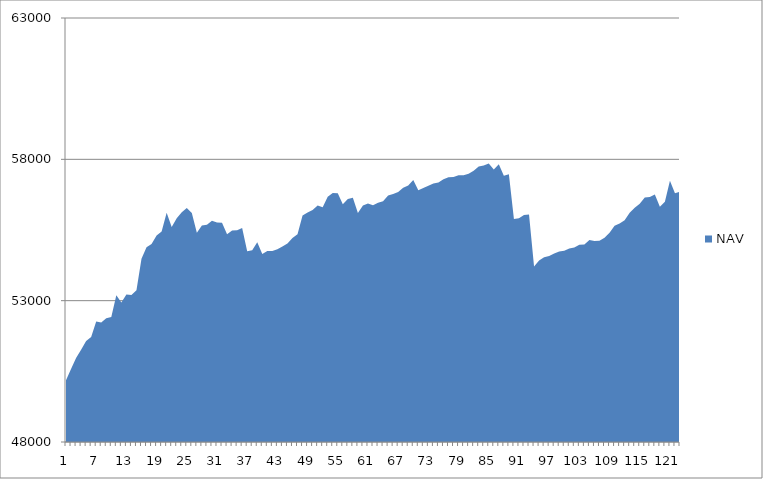
| Category | NAV |
|---|---|
| 0 | 50185.185 |
| 1 | 50585.185 |
| 2 | 50973.977 |
| 3 | 51265.977 |
| 4 | 51576.741 |
| 5 | 51711.523 |
| 6 | 52262.893 |
| 7 | 52230.24 |
| 8 | 52381.556 |
| 9 | 52425.915 |
| 10 | 53192.581 |
| 11 | 52939.146 |
| 12 | 53220.069 |
| 13 | 53197.341 |
| 14 | 53369.61 |
| 15 | 54480.721 |
| 16 | 54888.365 |
| 17 | 55001.902 |
| 18 | 55308.308 |
| 19 | 55448.308 |
| 20 | 56110.305 |
| 21 | 55610.305 |
| 22 | 55916.954 |
| 23 | 56129.798 |
| 24 | 56279.798 |
| 25 | 56105.301 |
| 26 | 55401.645 |
| 27 | 55657.201 |
| 28 | 55686.925 |
| 29 | 55823.001 |
| 30 | 55769.596 |
| 31 | 55759.375 |
| 32 | 55350.284 |
| 33 | 55480.284 |
| 34 | 55492.498 |
| 35 | 55570.42 |
| 36 | 54746.89 |
| 37 | 54783.7 |
| 38 | 55066.459 |
| 39 | 54651.074 |
| 40 | 54754.078 |
| 41 | 54760.213 |
| 42 | 54816.924 |
| 43 | 54917.296 |
| 44 | 55025.73 |
| 45 | 55220.535 |
| 46 | 55353.465 |
| 47 | 56009.309 |
| 48 | 56118.959 |
| 49 | 56205.212 |
| 50 | 56362.876 |
| 51 | 56307.394 |
| 52 | 56678.935 |
| 53 | 56813.264 |
| 54 | 56799.502 |
| 55 | 56409.112 |
| 56 | 56596.44 |
| 57 | 56640.493 |
| 58 | 56102.227 |
| 59 | 56370.449 |
| 60 | 56434.248 |
| 61 | 56376.841 |
| 62 | 56464.524 |
| 63 | 56518.022 |
| 64 | 56724.747 |
| 65 | 56770.361 |
| 66 | 56848.099 |
| 67 | 56992.896 |
| 68 | 57073.571 |
| 69 | 57266.481 |
| 70 | 56908.016 |
| 71 | 56984.939 |
| 72 | 57069.276 |
| 73 | 57147.627 |
| 74 | 57179.83 |
| 75 | 57291.17 |
| 76 | 57366.35 |
| 77 | 57371.599 |
| 78 | 57439.215 |
| 79 | 57440.895 |
| 80 | 57490.895 |
| 81 | 57593.679 |
| 82 | 57746.643 |
| 83 | 57785.413 |
| 84 | 57849.748 |
| 85 | 57639.346 |
| 86 | 57828.82 |
| 87 | 57417.055 |
| 88 | 57471.335 |
| 89 | 55888.376 |
| 90 | 55913.907 |
| 91 | 56031.989 |
| 92 | 56044.711 |
| 93 | 54210.631 |
| 94 | 54422.612 |
| 95 | 54536.647 |
| 96 | 54575.903 |
| 97 | 54670.229 |
| 98 | 54737.367 |
| 99 | 54762.386 |
| 100 | 54842.923 |
| 101 | 54881.385 |
| 102 | 54978.816 |
| 103 | 54991.283 |
| 104 | 55149.699 |
| 105 | 55109.498 |
| 106 | 55121.656 |
| 107 | 55227.569 |
| 108 | 55405.15 |
| 109 | 55650.183 |
| 110 | 55733.424 |
| 111 | 55846.244 |
| 112 | 56110.95 |
| 113 | 56283.172 |
| 114 | 56430.541 |
| 115 | 56648.489 |
| 116 | 56663.919 |
| 117 | 56752.272 |
| 118 | 56318.108 |
| 119 | 56496.442 |
| 120 | 57240.145 |
| 121 | 56797.081 |
| 122 | 56857.303 |